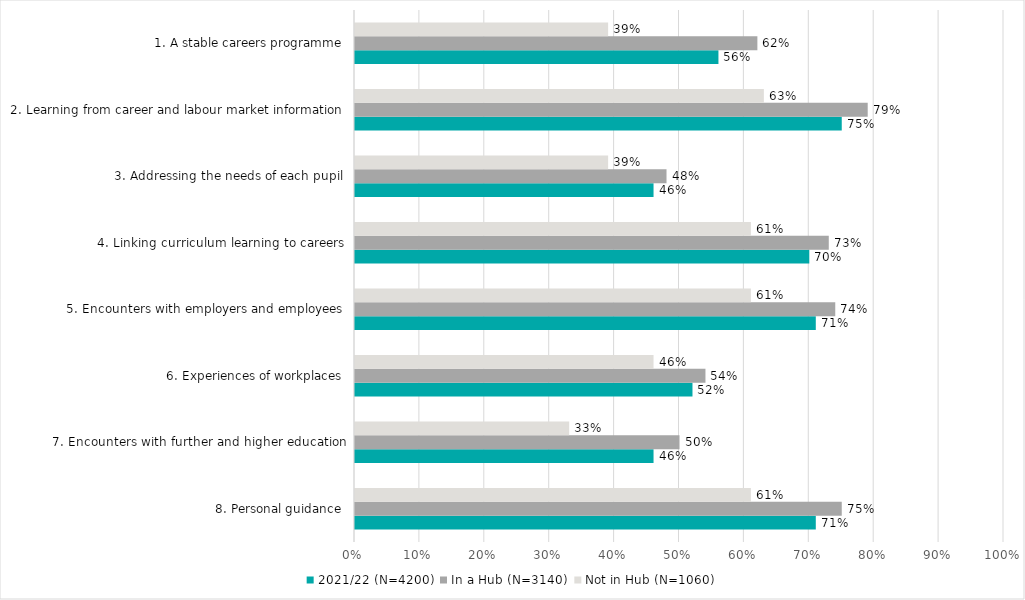
| Category | 2021/22 (N=4200) | In a Hub (N=3140) | Not in Hub (N=1060) |
|---|---|---|---|
| 8. Personal guidance | 0.71 | 0.75 | 0.61 |
| 7. Encounters with further and higher education | 0.46 | 0.5 | 0.33 |
| 6. Experiences of workplaces | 0.52 | 0.54 | 0.46 |
| 5. Encounters with employers and employees | 0.71 | 0.74 | 0.61 |
| 4. Linking curriculum learning to careers | 0.7 | 0.73 | 0.61 |
| 3. Addressing the needs of each pupil | 0.46 | 0.48 | 0.39 |
| 2. Learning from career and labour market information | 0.75 | 0.79 | 0.63 |
| 1. A stable careers programme | 0.56 | 0.62 | 0.39 |